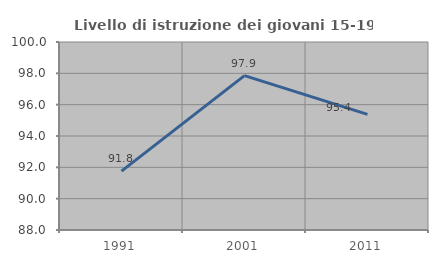
| Category | Livello di istruzione dei giovani 15-19 anni |
|---|---|
| 1991.0 | 91.758 |
| 2001.0 | 97.857 |
| 2011.0 | 95.385 |